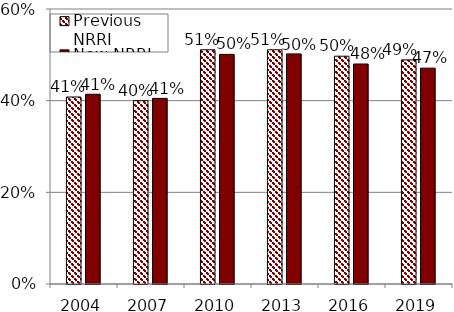
| Category | Previous NRRI | New NRRI |
|---|---|---|
| 2004.0 | 0.408 | 0.414 |
| 2007.0 | 0.4 | 0.405 |
| 2010.0 | 0.511 | 0.501 |
| 2013.0 | 0.511 | 0.502 |
| 2016.0 | 0.497 | 0.48 |
| 2019.0 | 0.489 | 0.471 |